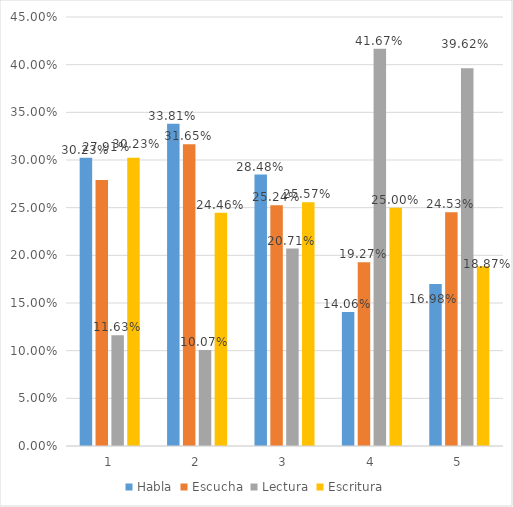
| Category | Habla | Escucha | Lectura | Escritura |
|---|---|---|---|---|
| 0 | 0.302 | 0.279 | 0.116 | 0.302 |
| 1 | 0.338 | 0.317 | 0.101 | 0.245 |
| 2 | 0.285 | 0.252 | 0.207 | 0.256 |
| 3 | 0.141 | 0.193 | 0.417 | 0.25 |
| 4 | 0.17 | 0.245 | 0.396 | 0.189 |